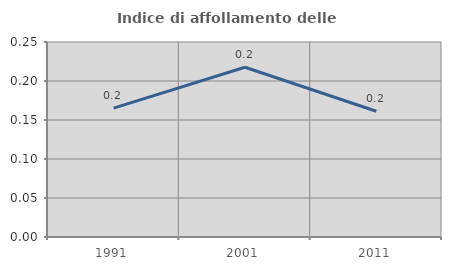
| Category | Indice di affollamento delle abitazioni  |
|---|---|
| 1991.0 | 0.165 |
| 2001.0 | 0.218 |
| 2011.0 | 0.161 |